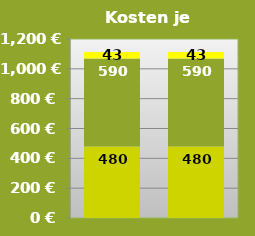
| Category | Zukaufspreis
Zeitraum | Futterkosten* | sonstige
Direktkosten |
|---|---|---|---|
|  | 480 | 589.875 | 43 |
|  | 480 | 589.875 | 43 |